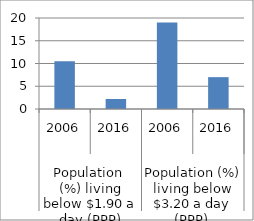
| Category | Series 0 |
|---|---|
| 0 | 10.5 |
| 1 | 2.2 |
| 2 | 19 |
| 3 | 7 |